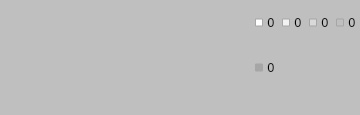
| Category | Series 0 |
|---|---|
| 0.0 | 0 |
| 0.0 | 0 |
| 0.0 | 0 |
| 0.0 | 0 |
| 0.0 | 0 |